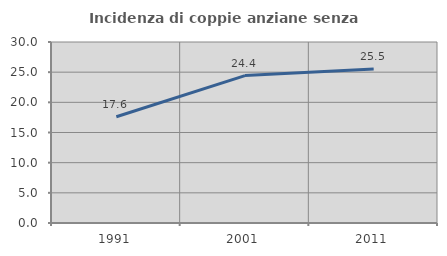
| Category | Incidenza di coppie anziane senza figli  |
|---|---|
| 1991.0 | 17.606 |
| 2001.0 | 24.436 |
| 2011.0 | 25.514 |